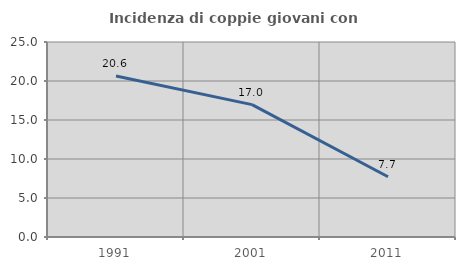
| Category | Incidenza di coppie giovani con figli |
|---|---|
| 1991.0 | 20.635 |
| 2001.0 | 16.972 |
| 2011.0 | 7.729 |